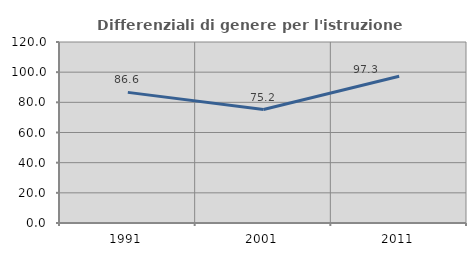
| Category | Differenziali di genere per l'istruzione superiore |
|---|---|
| 1991.0 | 86.609 |
| 2001.0 | 75.247 |
| 2011.0 | 97.256 |